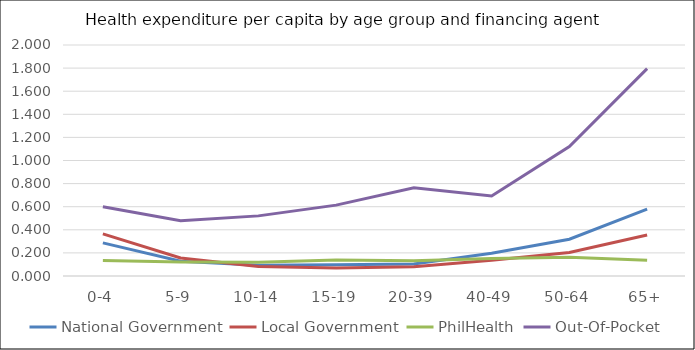
| Category | National Government | Local Government | PhilHealth | Out-Of-Pocket |
|---|---|---|---|---|
| 0-4 | 0.287 | 0.365 | 0.134 | 0.599 |
| 5-9 | 0.127 | 0.156 | 0.121 | 0.479 |
| 10-14 | 0.092 | 0.082 | 0.119 | 0.521 |
| 15-19 | 0.098 | 0.069 | 0.138 | 0.613 |
| 20-39 | 0.104 | 0.081 | 0.132 | 0.764 |
| 40-49 | 0.197 | 0.136 | 0.152 | 0.693 |
| 50-64 | 0.319 | 0.204 | 0.162 | 1.121 |
| 65+ | 0.579 | 0.355 | 0.136 | 1.796 |